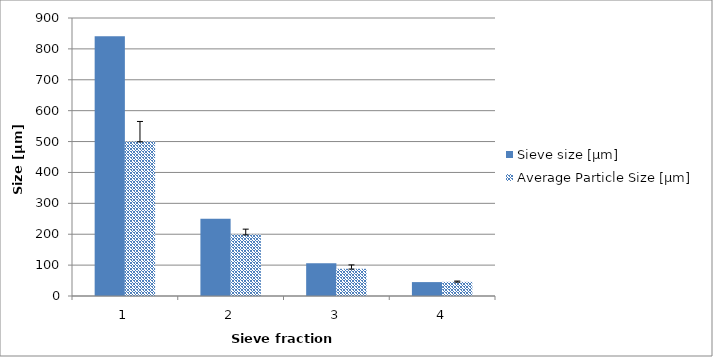
| Category | Sieve size [µm]  | Average Particle Size [µm]  |
|---|---|---|
| 0 | 841 | 500.121 |
| 1 | 250 | 198.949 |
| 2 | 106 | 88.078 |
| 3 | 45 | 45.889 |